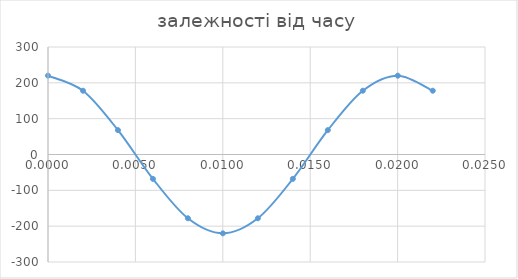
| Category | Series 0 |
|---|---|
| 0.0 | 220 |
| 0.0020010144290380848 | 177.984 |
| 0.0040020288580761695 | 67.984 |
| 0.006003043287114254 | -67.984 |
| 0.008004057716152337 | -177.984 |
| 0.01000507214519042 | -220 |
| 0.012006086574228504 | -177.984 |
| 0.014007101003266588 | -67.984 |
| 0.01600811543230467 | 67.984 |
| 0.018009129861342753 | 177.984 |
| 0.020010144290380835 | 220 |
| 0.022011158719418916 | 177.984 |